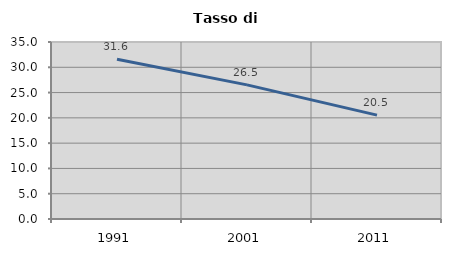
| Category | Tasso di disoccupazione   |
|---|---|
| 1991.0 | 31.608 |
| 2001.0 | 26.519 |
| 2011.0 | 20.538 |